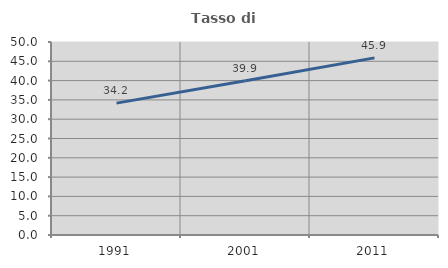
| Category | Tasso di occupazione   |
|---|---|
| 1991.0 | 34.165 |
| 2001.0 | 39.947 |
| 2011.0 | 45.888 |